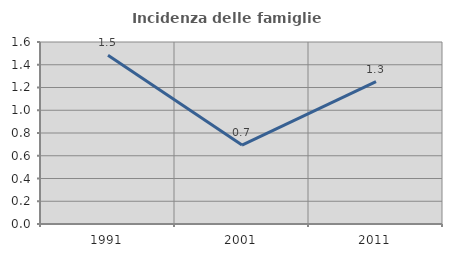
| Category | Incidenza delle famiglie numerose |
|---|---|
| 1991.0 | 1.484 |
| 2001.0 | 0.694 |
| 2011.0 | 1.251 |